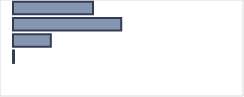
| Category | Series 0 |
|---|---|
| 0 | 35.239 |
| 1 | 47.669 |
| 2 | 16.659 |
| 3 | 0.433 |
| 4 | 0 |